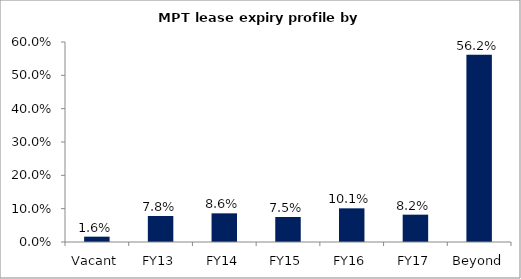
| Category | Series 0 |
|---|---|
| Vacant | 0.016 |
| FY13 | 0.078 |
| FY14 | 0.086 |
| FY15 | 0.075 |
| FY16 | 0.101 |
| FY17 | 0.082 |
| Beyond | 0.562 |